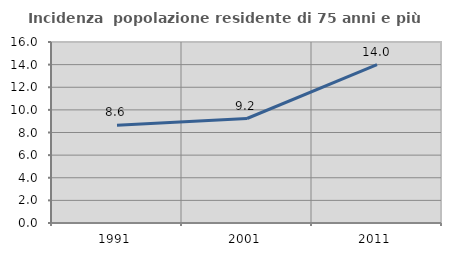
| Category | Incidenza  popolazione residente di 75 anni e più |
|---|---|
| 1991.0 | 8.645 |
| 2001.0 | 9.238 |
| 2011.0 | 14.009 |